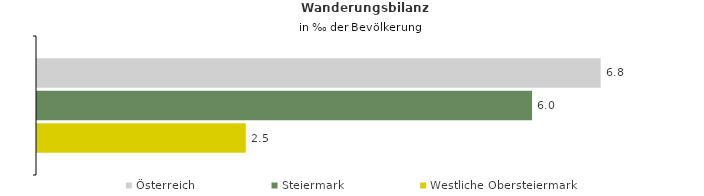
| Category | Österreich | Steiermark | Westliche Obersteiermark |
|---|---|---|---|
| Wanderungsrate in ‰ der Bevölkerung, Periode 2018-2022 | 6.822 | 5.992 | 2.526 |